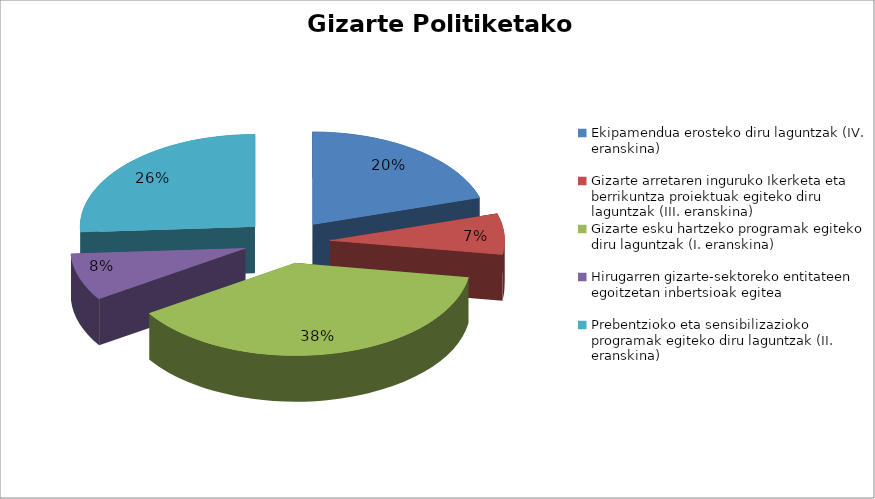
| Category |  Eskaerak  | Ezetsiak | Emakida |
|---|---|---|---|
| Ekipamendua erosteko diru laguntzak (IV. eranskina) | 54 | 14 | 31648.95 |
| Gizarte arretaren inguruko Ikerketa eta berrikuntza proiektuak egiteko diru laguntzak (III. eranskina) | 19 | 11 | 39000 |
| Gizarte esku hartzeko programak egiteko diru laguntzak (I. eranskina) | 102 | 11 | 804344 |
| Hirugarren gizarte-sektoreko entitateen egoitzetan inbertsioak egitea | 22 | 9 | 947266.92 |
| Prebentzioko eta sensibilizazioko programak egiteko diru laguntzak (II. eranskina) | 69 | 7 | 220182 |